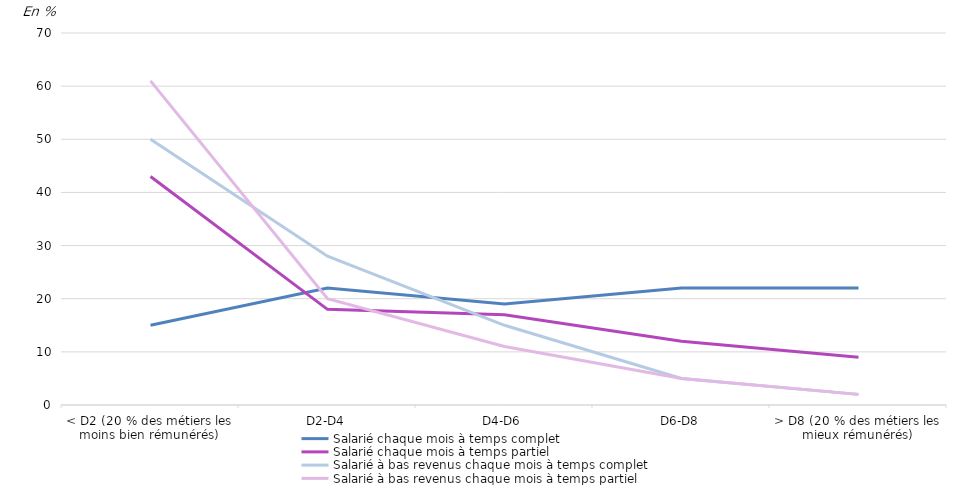
| Category | Salarié chaque mois à temps complet | Salarié chaque mois à temps partiel | Salarié à bas revenus chaque mois à temps complet | Salarié à bas revenus chaque mois à temps partiel |
|---|---|---|---|---|
| < D2 (20 % des métiers les moins bien rémunérés) | 15 | 43 | 50 | 61 |
| D2-D4 | 22 | 18 | 28 | 20 |
| D4-D6 | 19 | 17 | 15 | 11 |
| D6-D8 | 22 | 12 | 5 | 5 |
| > D8 (20 % des métiers les mieux rémunérés) | 22 | 9 | 2 | 2 |